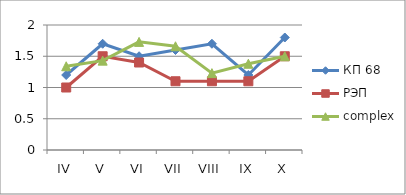
| Category | КП 68 | РЭП  | complex |
|---|---|---|---|
| IV | 1.2 | 1 | 1.34 |
| V | 1.7 | 1.5 | 1.43 |
| VI | 1.5 | 1.4 | 1.73 |
| VII | 1.6 | 1.1 | 1.66 |
| VIII | 1.7 | 1.1 | 1.23 |
| IX | 1.2 | 1.1 | 1.38 |
| X | 1.8 | 1.5 | 1.5 |